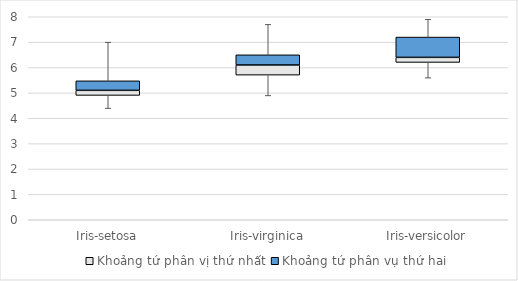
| Category | Series 0 | Khoảng tứ phân vị thứ nhất | Khoảng tứ phân vụ thứ hai |
|---|---|---|---|
| Iris-setosa | 4.9 | 0.2 | 0.375 |
| Iris-virginica | 5.7 | 0.4 | 0.4 |
| Iris-versicolor | 6.2 | 0.2 | 0.8 |